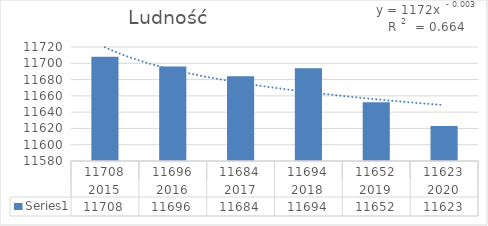
| Category | Series 0 |
|---|---|
| 0 | 11708 |
| 1 | 11696 |
| 2 | 11684 |
| 3 | 11694 |
| 4 | 11652 |
| 5 | 11623 |